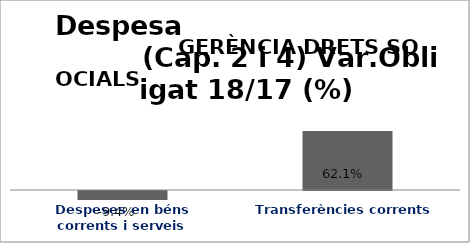
| Category | Series 0 |
|---|---|
| Despeses en béns corrents i serveis | -0.094 |
| Transferències corrents | 0.621 |